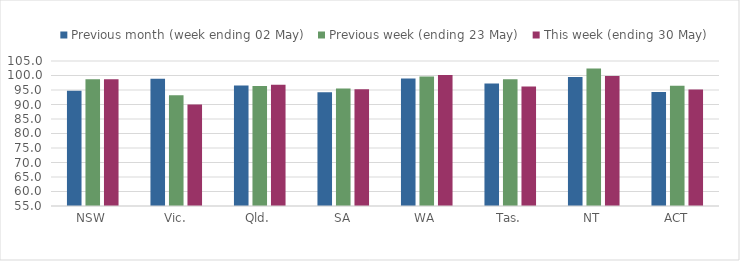
| Category | Previous month (week ending 02 May) | Previous week (ending 23 May) | This week (ending 30 May) |
|---|---|---|---|
| NSW | 94.71 | 98.676 | 98.712 |
| Vic. | 98.895 | 93.201 | 90.039 |
| Qld. | 96.56 | 96.409 | 96.785 |
| SA | 94.253 | 95.554 | 95.277 |
| WA | 98.963 | 99.628 | 100.161 |
| Tas. | 97.248 | 98.714 | 96.242 |
| NT | 99.473 | 102.428 | 99.863 |
| ACT | 94.326 | 96.464 | 95.188 |